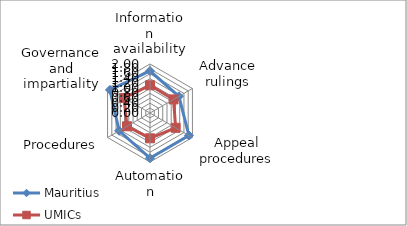
| Category | Mauritius | UMICs |
|---|---|---|
| Information availability | 1.714 | 1.134 |
| Advance rulings | 1.364 | 1.109 |
| Appeal procedures | 1.833 | 1.208 |
| Automation | 1.846 | 1.033 |
| Procedures | 1.455 | 1.084 |
| Governance and impartiality | 1.889 | 1.223 |